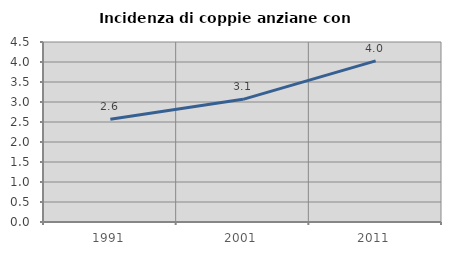
| Category | Incidenza di coppie anziane con figli |
|---|---|
| 1991.0 | 2.571 |
| 2001.0 | 3.066 |
| 2011.0 | 4.028 |